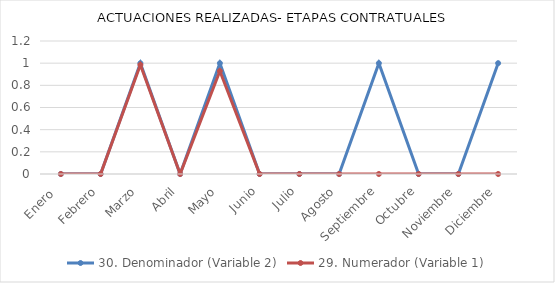
| Category | 30. Denominador (Variable 2) | 29. Numerador (Variable 1) |
|---|---|---|
| Enero  | 0 | 0 |
| Febrero | 0 | 0 |
| Marzo | 1 | 0.986 |
| Abril | 0 | 0 |
| Mayo | 1 | 0.929 |
| Junio | 0 | 0 |
| Julio | 0 | 0 |
| Agosto | 0 | 0 |
| Septiembre | 1 | 0 |
| Octubre | 0 | 0 |
| Noviembre | 0 | 0 |
| Diciembre | 1 | 0 |